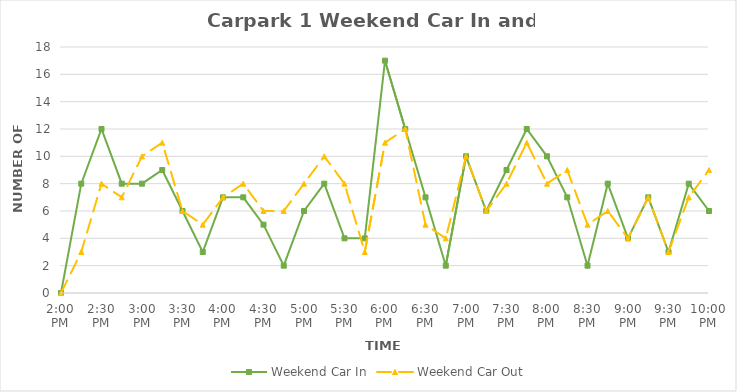
| Category | Weekend Car In | Weekend Car Out |
|---|---|---|
| 0.5833333333333334 | 0 | 0 |
| 0.59375 | 8 | 3 |
| 0.604166666666667 | 12 | 8 |
| 0.614583333333334 | 8 | 7 |
| 0.625 | 8 | 10 |
| 0.635416666666667 | 9 | 11 |
| 0.645833333333334 | 6 | 6 |
| 0.656250000000001 | 3 | 5 |
| 0.666666666666667 | 7 | 7 |
| 0.677083333333334 | 7 | 8 |
| 0.687500000000001 | 5 | 6 |
| 0.697916666666668 | 2 | 6 |
| 0.708333333333335 | 6 | 8 |
| 0.718750000000001 | 8 | 10 |
| 0.729166666666668 | 4 | 8 |
| 0.739583333333335 | 4 | 3 |
| 0.75 | 17 | 11 |
| 0.7604166666666666 | 12 | 12 |
| 0.7708333333333334 | 7 | 5 |
| 0.78125 | 2 | 4 |
| 0.7916666666666666 | 10 | 10 |
| 0.8020833333333334 | 6 | 6 |
| 0.8125 | 9 | 8 |
| 0.8229166666666666 | 12 | 11 |
| 0.8333333333333334 | 10 | 8 |
| 0.84375 | 7 | 9 |
| 0.8541666666666666 | 2 | 5 |
| 0.8645833333333334 | 8 | 6 |
| 0.875 | 4 | 4 |
| 0.8854166666666666 | 7 | 7 |
| 0.8958333333333334 | 3 | 3 |
| 0.90625 | 8 | 7 |
| 0.9166666666666666 | 6 | 9 |